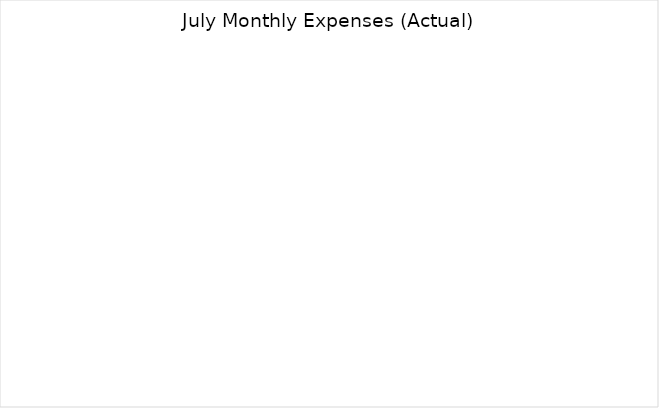
| Category | Series 0 |
|---|---|
| 0 | 0 |
| 1 | 0 |
| 2 | 0 |